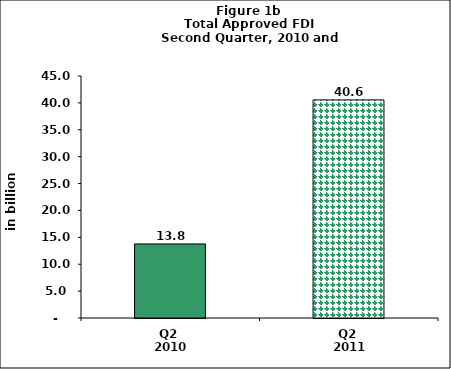
| Category | Series 0 |
|---|---|
| Q2 
2010 | 13.773 |
| Q2 
2011 | 40.556 |